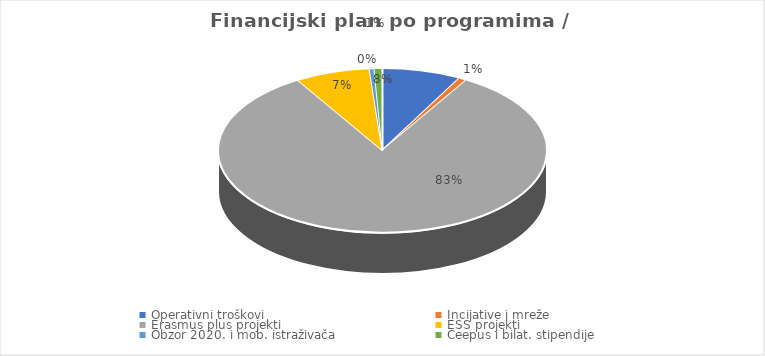
| Category | Iznos  | Udio u ukupnom proračunu u % |
|---|---|---|
| Operativni troškovi | 27668693 | 0.078 |
| Incijative i mreže | 2779515 | 0.008 |
| Erasmus plus projekti | 293730675 | 0.828 |
| ESS projekti  | 26154075 | 0.074 |
| Obzor 2020. i mob. istraživača | 1698197 | 0.005 |
| Ceepus i bilat. stipendije | 2803000 | 0.008 |